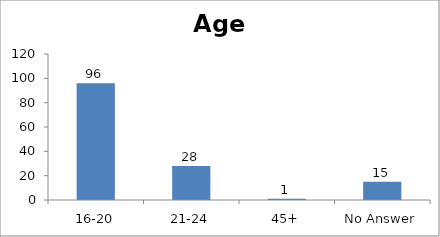
| Category | Age |
|---|---|
| 16-20 | 96 |
| 21-24 | 28 |
| 45+ | 1 |
| No Answer | 15 |